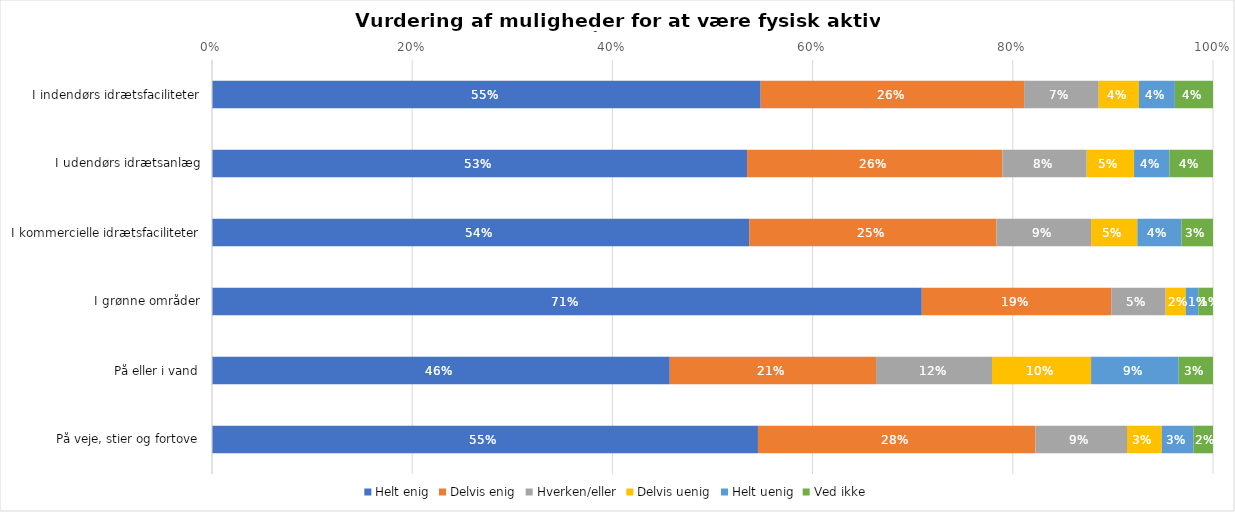
| Category | Helt enig | Delvis enig | Hverken/eller | Delvis uenig | Helt uenig | Ved ikke |
|---|---|---|---|---|---|---|
| I indendørs idrætsfaciliteter | 0.548 | 0.263 | 0.074 | 0.04 | 0.036 | 0.038 |
| I udendørs idrætsanlæg | 0.535 | 0.255 | 0.084 | 0.047 | 0.035 | 0.044 |
| I kommercielle idrætsfaciliteter | 0.537 | 0.247 | 0.095 | 0.046 | 0.044 | 0.032 |
| I grønne områder | 0.709 | 0.189 | 0.054 | 0.02 | 0.013 | 0.015 |
| På eller i vand | 0.457 | 0.206 | 0.116 | 0.099 | 0.088 | 0.034 |
| På veje, stier og fortove | 0.545 | 0.277 | 0.091 | 0.035 | 0.032 | 0.02 |